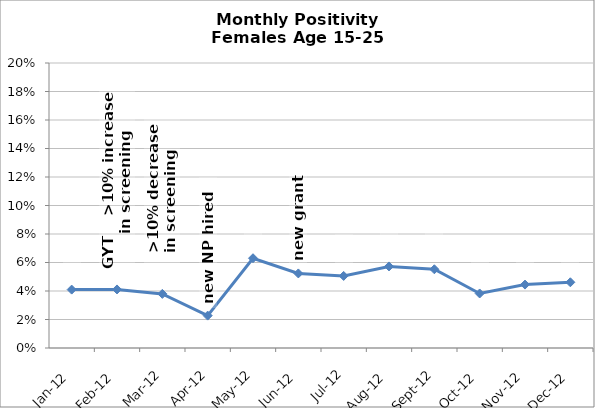
| Category | Positivity |
|---|---|
| 2012-01-01 | 0.041 |
| 2012-02-01 | 0.041 |
| 2012-03-01 | 0.038 |
| 2012-04-01 | 0.023 |
| 2012-05-01 | 0.063 |
| 2012-06-01 | 0.052 |
| 2012-07-01 | 0.051 |
| 2012-08-01 | 0.057 |
| 2012-09-01 | 0.055 |
| 2012-10-01 | 0.038 |
| 2012-11-01 | 0.044 |
| 2012-12-01 | 0.046 |